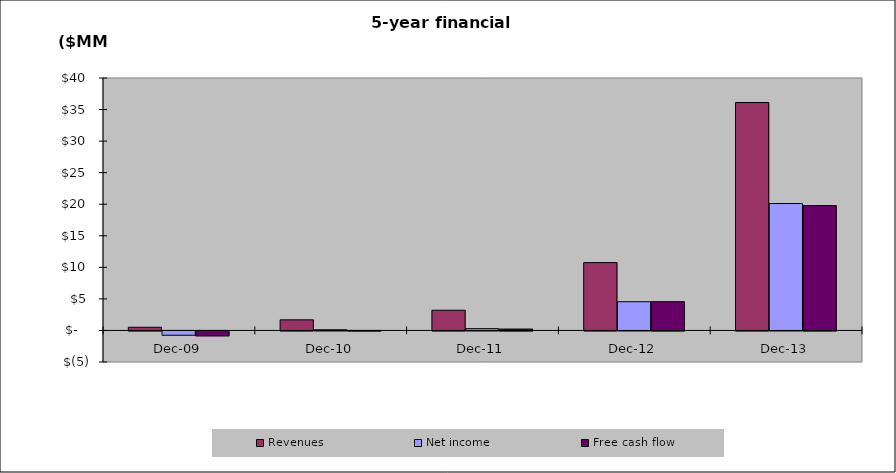
| Category | Revenues | Net income | Free cash flow |
|---|---|---|---|
| 2009-12-31 | 500000 | -680121.559 | -779418 |
| 2010-12-31 | 1680000 | 102617.103 | -15782.101 |
| 2011-12-31 | 3198720 | 281292.065 | 221301.117 |
| 2012-12-30 | 10747699.2 | 4550199.287 | 4557880.646 |
| 2013-12-30 | 36112269.312 | 20108066.91 | 19785610.708 |